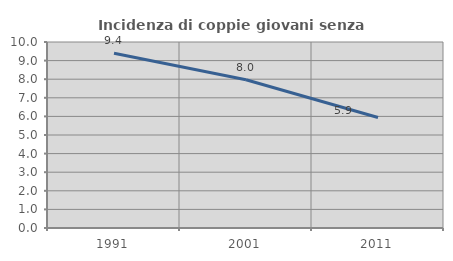
| Category | Incidenza di coppie giovani senza figli |
|---|---|
| 1991.0 | 9.398 |
| 2001.0 | 7.969 |
| 2011.0 | 5.938 |